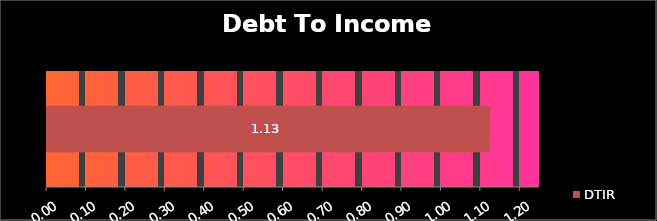
| Category | DTIR |
|---|---|
| 0 | 1.126 |